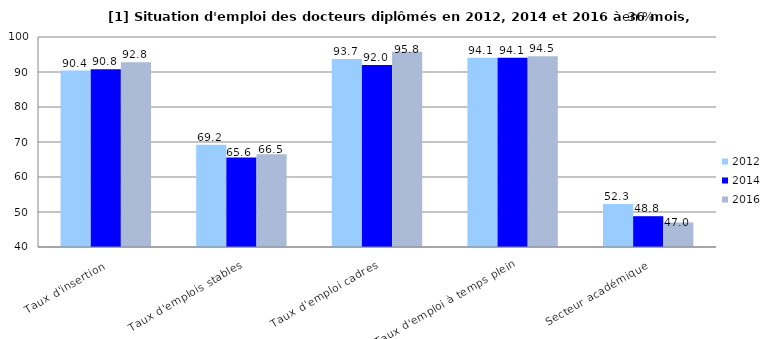
| Category | 2012 | 2014 | 2016 |
|---|---|---|---|
| Taux d'insertion | 90.4 | 90.8 | 92.8 |
| Taux d'emplois stables | 69.2 | 65.6 | 66.5 |
| Taux d'emploi cadres | 93.7 | 92 | 95.8 |
| Taux d'emploi à temps plein | 94.1 | 94.1 | 94.5 |
| Secteur académique | 52.3 | 48.8 | 47 |